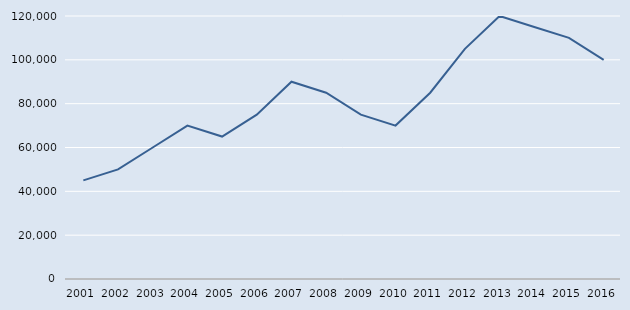
| Category | Series 1 |
|---|---|
| 2001.0 | 45000 |
| 2002.0 | 50000 |
| 2003.0 | 60000 |
| 2004.0 | 70000 |
| 2005.0 | 65000 |
| 2006.0 | 75000 |
| 2007.0 | 90000 |
| 2008.0 | 85000 |
| 2009.0 | 75000 |
| 2010.0 | 70000 |
| 2011.0 | 85000 |
| 2012.0 | 105000 |
| 2013.0 | 120000 |
| 2014.0 | 115000 |
| 2015.0 | 110000 |
| 2016.0 | 100000 |